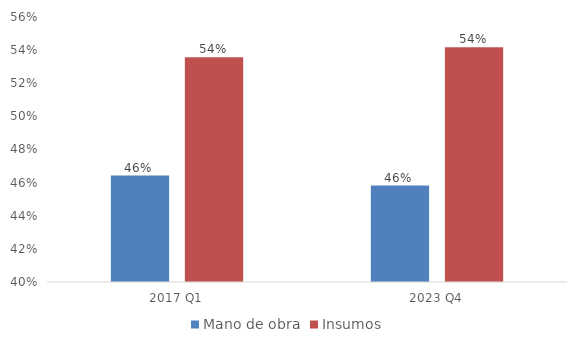
| Category | Mano de obra | Insumos |
|---|---|---|
| 2017 Q1 | 0.464 | 0.536 |
| 2023 Q4 | 0.458 | 0.542 |